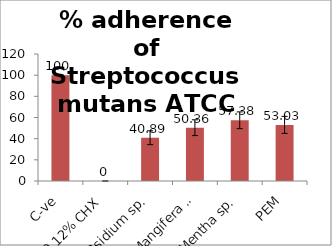
| Category | % adherence of Streptococcus mutans ATCC 25175 Streptococcus mutans ATCC 25175 |
|---|---|
| C-ve | 100 |
| 0.12% CHX | 0 |
| Psidium sp. | 40.89 |
| Mangifera sp. | 50.36 |
| Mentha sp. | 57.38 |
| PEM | 53.03 |